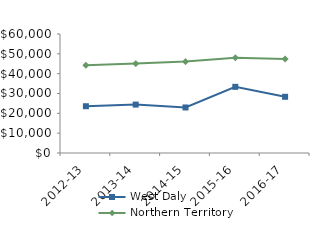
| Category | West Daly | Northern Territory |
|---|---|---|
| 2012-13 | 23584.21 | 44232.02 |
| 2013-14 | 24406.63 | 45075.51 |
| 2014-15 | 22954.07 | 46083.65 |
| 2015-16 | 33355.46 | 48046.27 |
| 2016-17 | 28341.18 | 47367.05 |